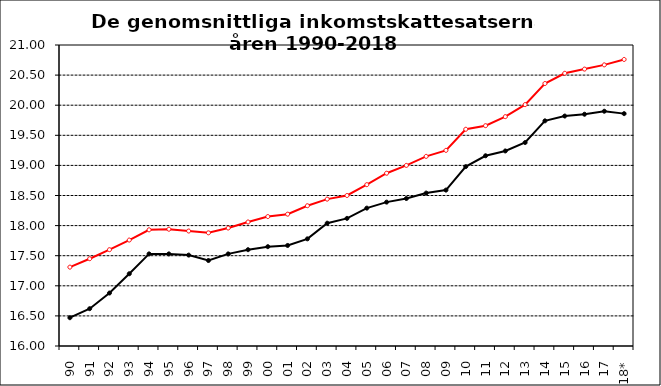
| Category | Series 2 | Series 3 |
|---|---|---|
| 90 | 16.47 | 17.31 |
| 91 | 16.62 | 17.45 |
| 92 | 16.88 | 17.6 |
| 93 | 17.2 | 17.76 |
| 94 | 17.53 | 17.93 |
| 95 | 17.53 | 17.94 |
| 96 | 17.51 | 17.91 |
| 97 | 17.42 | 17.88 |
| 98 | 17.53 | 17.96 |
| 99 | 17.6 | 18.06 |
| 00 | 17.65 | 18.15 |
| 01 | 17.67 | 18.19 |
| 02 | 17.78 | 18.33 |
| 03 | 18.04 | 18.44 |
| 04 | 18.12 | 18.5 |
| 05 | 18.29 | 18.68 |
| 06 | 18.39 | 18.87 |
| 07 | 18.45 | 19 |
| 08 | 18.54 | 19.15 |
| 09 | 18.59 | 19.25 |
| 10 | 18.98 | 19.6 |
| 11 | 19.16 | 19.66 |
| 12 | 19.24 | 19.81 |
| 13 | 19.38 | 20.01 |
| 14 | 19.74 | 20.36 |
| 15 | 19.82 | 20.53 |
| 16 | 19.85 | 20.6 |
| 17 | 19.9 | 20.67 |
| 18* | 19.86 | 20.76 |